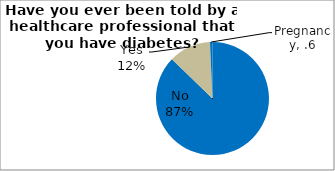
| Category | Series 0 |
|---|---|
| No | 87.248 |
| Yes | 12.037 |
| Pregnancy | 0.715 |